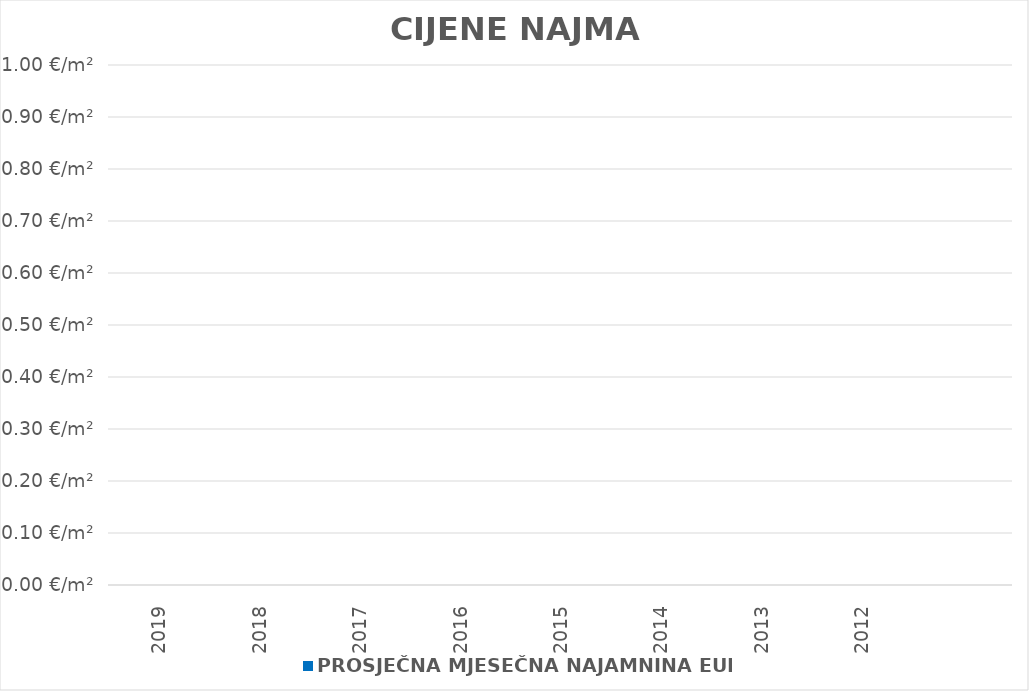
| Category | PROSJEČNA MJESEČNA NAJAMNINA EUR/m² |
|---|---|
| 2019 | 0 |
| 2018 | 0 |
| 2017 | 0 |
| 2016 | 0 |
| 2015 | 0 |
| 2014 | 0 |
| 2013 | 0 |
| 2012 | 0 |